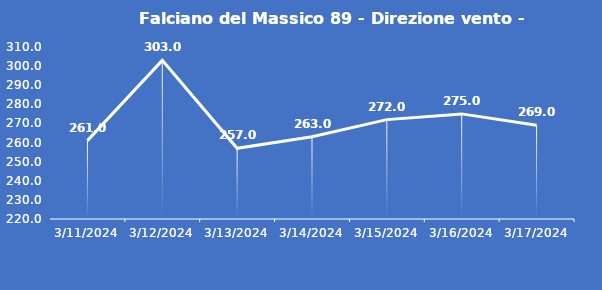
| Category | Falciano del Massico 89 - Direzione vento - Grezzo (°N) |
|---|---|
| 3/11/24 | 261 |
| 3/12/24 | 303 |
| 3/13/24 | 257 |
| 3/14/24 | 263 |
| 3/15/24 | 272 |
| 3/16/24 | 275 |
| 3/17/24 | 269 |